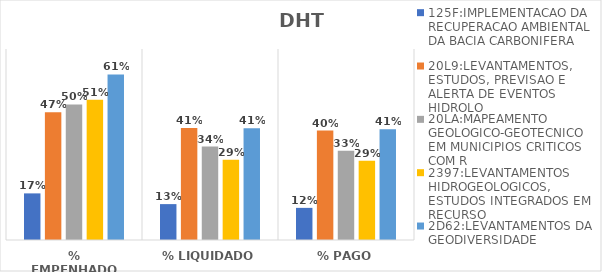
| Category | 125F:IMPLEMENTACAO DA RECUPERACAO AMBIENTAL DA BACIA CARBONIFERA | 20L9:LEVANTAMENTOS, ESTUDOS, PREVISAO E ALERTA DE EVENTOS HIDROLO | 20LA:MAPEAMENTO GEOLOGICO-GEOTECNICO EM MUNICIPIOS CRITICOS COM R | 2397:LEVANTAMENTOS HIDROGEOLOGICOS, ESTUDOS INTEGRADOS EM RECURSO | 2D62:LEVANTAMENTOS DA GEODIVERSIDADE |
|---|---|---|---|---|---|
| % EMPENHADO | 0.171 | 0.469 | 0.497 | 0.514 | 0.607 |
| % LIQUIDADO | 0.132 | 0.411 | 0.342 | 0.294 | 0.41 |
| % PAGO | 0.118 | 0.401 | 0.327 | 0.291 | 0.406 |